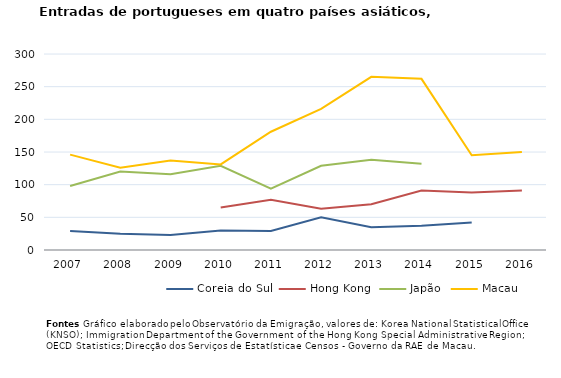
| Category | Coreia do Sul | Hong Kong | Japão | Macau |
|---|---|---|---|---|
| 2007.0 | 29 | 0 | 98 | 146 |
| 2008.0 | 25 | 0 | 120 | 126 |
| 2009.0 | 23 | 0 | 116 | 137 |
| 2010.0 | 30 | 65 | 129 | 131 |
| 2011.0 | 29 | 77 | 94 | 181 |
| 2012.0 | 50 | 63 | 129 | 216 |
| 2013.0 | 35 | 70 | 138 | 265 |
| 2014.0 | 37 | 91 | 132 | 262 |
| 2015.0 | 42 | 88 | 0 | 145 |
| 2016.0 | 0 | 91 | 0 | 150 |